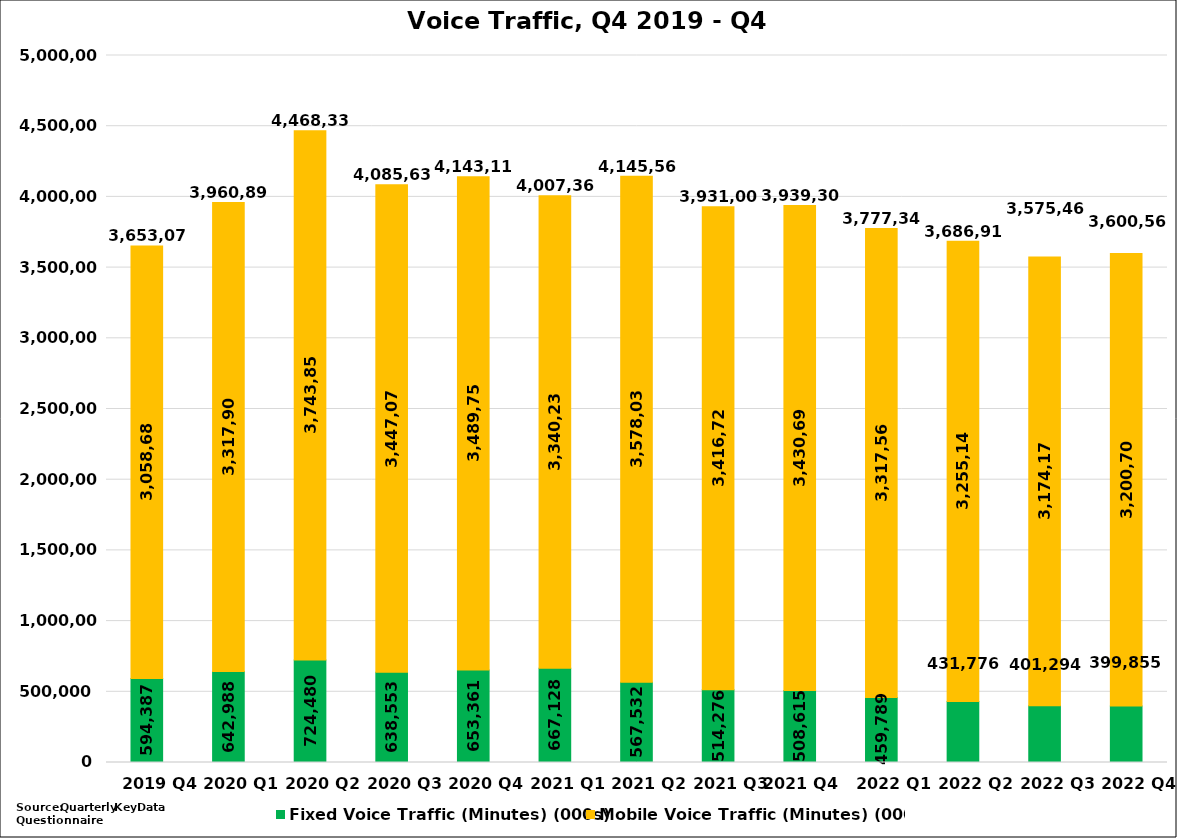
| Category | Fixed Voice Traffic (Minutes) (000s) | Mobile Voice Traffic (Minutes) (000s) | Total Voice Traffic (Minutes) (000s) |
|---|---|---|---|
| 2019 Q4 | 594387.173 | 3058682.507 | 3653069.68 |
| 2020 Q1 | 642988 | 3317905.655 | 3960893.655 |
| 2020 Q2 | 724479.867 | 3743853.165 | 4468333.032 |
| 2020 Q3 | 638552.857 | 3447078.14 | 4085630.997 |
| 2020 Q4 | 653361.114 | 3489753.521 | 4143114.635 |
| 2021 Q1 | 667128.48 | 3340235.217 | 4007363.697 |
| 2021 Q2 | 567531.791 | 3578036.303 | 4145568.093 |
| 2021 Q3 | 514276.083 | 3416726.808 | 3931002.891 |
| 2021 Q4  | 508615.225 | 3430689.797 | 3939305.022 |
| 2022 Q1 | 459788.747 | 3317560.386 | 3777349.133 |
| 2022 Q2 | 431775.881 | 3255142.202 | 3686918.083 |
| 2022 Q3 | 401293.768 | 3174171.786 | 3575465.554 |
| 2022 Q4 | 399855.167 | 3200704.398 | 3600559.565 |